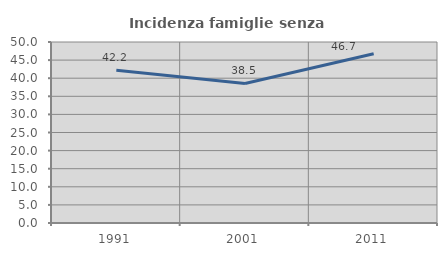
| Category | Incidenza famiglie senza nuclei |
|---|---|
| 1991.0 | 42.202 |
| 2001.0 | 38.542 |
| 2011.0 | 46.735 |